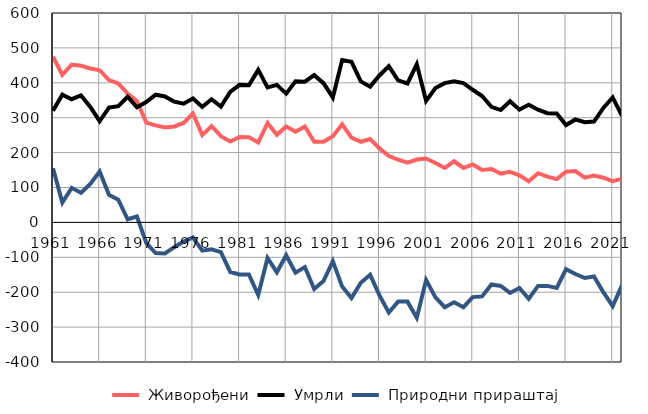
| Category |  Живорођени |  Умрли |  Природни прираштај |
|---|---|---|---|
| 1961.0 | 475 | 320 | 155 |
| 1962.0 | 423 | 366 | 57 |
| 1963.0 | 452 | 353 | 99 |
| 1964.0 | 449 | 364 | 85 |
| 1965.0 | 441 | 331 | 110 |
| 1966.0 | 436 | 290 | 146 |
| 1967.0 | 408 | 329 | 79 |
| 1968.0 | 398 | 333 | 65 |
| 1969.0 | 369 | 360 | 9 |
| 1970.0 | 347 | 330 | 17 |
| 1971.0 | 286 | 345 | -59 |
| 1972.0 | 278 | 366 | -88 |
| 1973.0 | 272 | 361 | -89 |
| 1974.0 | 275 | 346 | -71 |
| 1975.0 | 285 | 340 | -55 |
| 1976.0 | 312 | 355 | -43 |
| 1977.0 | 250 | 331 | -81 |
| 1978.0 | 276 | 353 | -77 |
| 1979.0 | 247 | 332 | -85 |
| 1980.0 | 232 | 374 | -142 |
| 1981.0 | 245 | 394 | -149 |
| 1982.0 | 244 | 393 | -149 |
| 1983.0 | 229 | 437 | -208 |
| 1984.0 | 285 | 387 | -102 |
| 1985.0 | 251 | 394 | -143 |
| 1986.0 | 275 | 369 | -94 |
| 1987.0 | 260 | 404 | -144 |
| 1988.0 | 275 | 403 | -128 |
| 1989.0 | 231 | 422 | -191 |
| 1990.0 | 231 | 399 | -168 |
| 1991.0 | 247 | 358 | -111 |
| 1992.0 | 281 | 465 | -184 |
| 1993.0 | 243 | 460 | -217 |
| 1994.0 | 231 | 404 | -173 |
| 1995.0 | 239 | 389 | -150 |
| 1996.0 | 212 | 421 | -209 |
| 1997.0 | 190 | 448 | -258 |
| 1998.0 | 180 | 407 | -227 |
| 1999.0 | 171 | 398 | -227 |
| 2000.0 | 180 | 453 | -273 |
| 2001.0 | 183 | 348 | -165 |
| 2002.0 | 170 | 385 | -215 |
| 2003.0 | 156 | 399 | -243 |
| 2004.0 | 175 | 404 | -229 |
| 2005.0 | 156 | 399 | -243 |
| 2006.0 | 166 | 380 | -214 |
| 2007.0 | 150 | 362 | -212 |
| 2008.0 | 153 | 331 | -178 |
| 2009.0 | 140 | 322 | -182 |
| 2010.0 | 145 | 347 | -202 |
| 2011.0 | 135 | 323 | -188 |
| 2012.0 | 118 | 337 | -219 |
| 2013.0 | 141 | 323 | -182 |
| 2014.0 | 131 | 313 | -182 |
| 2015.0 | 124 | 312 | -188 |
| 2016.0 | 145 | 279 | -134 |
| 2017.0 | 147 | 295 | -148 |
| 2018.0 | 128 | 287 | -159 |
| 2019.0 | 134 | 289 | -155 |
| 2020.0 | 128 | 328 | -200 |
| 2021.0 | 118 | 358 | -240 |
| 2022.0 | 125 | 305 | -180 |